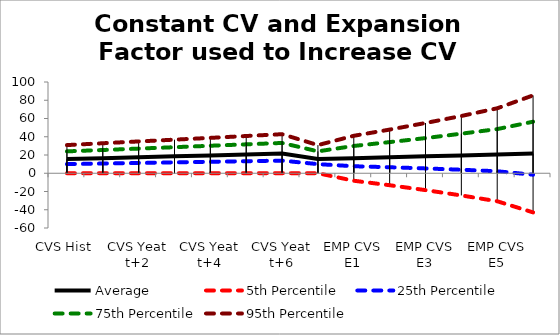
| Category | Average | 5th Percentile | 25th Percentile | 75th Percentile | 95th Percentile |
|---|---|---|---|---|---|
| CVS Hist | 15.561 | 0.018 | 9.998 | 23.994 | 30.853 |
| CVS Yeat t+1 | 16.56 | 0.042 | 10.65 | 25.47 | 32.882 |
| CVS Yeat t+2 | 17.561 | 0.028 | 11.283 | 27.026 | 34.863 |
| CVS Yeat t+3 | 18.56 | 0.04 | 11.928 | 28.551 | 36.812 |
| CVS Yeat t+4 | 19.56 | 0.06 | 12.58 | 30.14 | 38.761 |
| CVS Yeat t+5 | 20.563 | 0.065 | 13.203 | 31.699 | 40.815 |
| CVS Yeat t+6 | 21.56 | 0.073 | 13.84 | 33.202 | 42.813 |
| EMP Hist  | 15.561 | 0.018 | 9.998 | 23.994 | 30.853 |
| EMP CVS E1 | 16.56 | -8.216 | 7.695 | 29.925 | 41.043 |
| EMP CVS E2 | 17.561 | -13.12 | 6.575 | 34.125 | 47.84 |
| EMP CVS E3 | 18.56 | -18.479 | 5.296 | 38.543 | 55.064 |
| EMP CVS E4 | 19.56 | -24.314 | 3.855 | 43.364 | 62.762 |
| EMP CVS E5 | 20.566 | -30.676 | 2.168 | 48.408 | 71.196 |
| EMP CVS E6 | 21.56 | -42.901 | -1.599 | 56.485 | 85.319 |